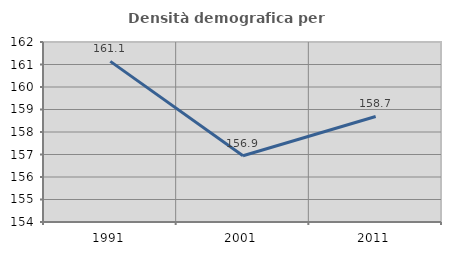
| Category | Densità demografica |
|---|---|
| 1991.0 | 161.138 |
| 2001.0 | 156.944 |
| 2011.0 | 158.691 |